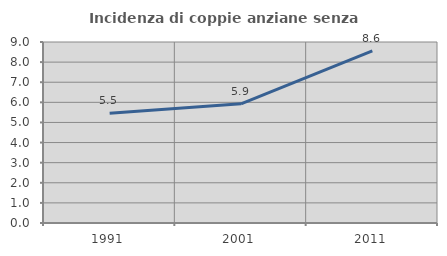
| Category | Incidenza di coppie anziane senza figli  |
|---|---|
| 1991.0 | 5.462 |
| 2001.0 | 5.926 |
| 2011.0 | 8.557 |